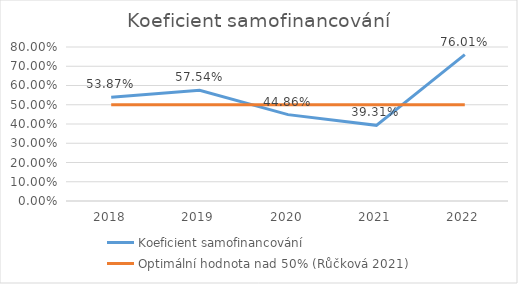
| Category | Koeficient samofinancování | Optimální hodnota nad 50% (Růčková 2021) |
|---|---|---|
| 2018.0 | 0.539 | 0.5 |
| 2019.0 | 0.575 | 0.5 |
| 2020.0 | 0.449 | 0.5 |
| 2021.0 | 0.393 | 0.5 |
| 2022.0 | 0.76 | 0.5 |